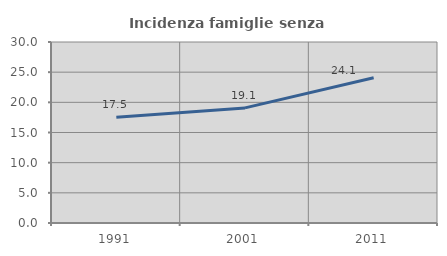
| Category | Incidenza famiglie senza nuclei |
|---|---|
| 1991.0 | 17.535 |
| 2001.0 | 19.078 |
| 2011.0 | 24.079 |